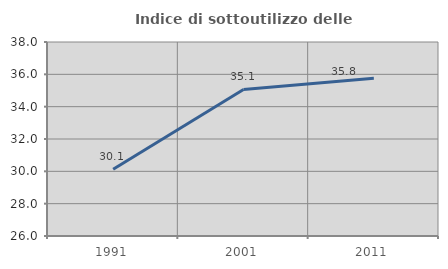
| Category | Indice di sottoutilizzo delle abitazioni  |
|---|---|
| 1991.0 | 30.127 |
| 2001.0 | 35.067 |
| 2011.0 | 35.756 |